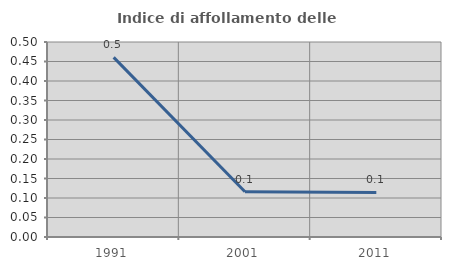
| Category | Indice di affollamento delle abitazioni  |
|---|---|
| 1991.0 | 0.461 |
| 2001.0 | 0.116 |
| 2011.0 | 0.114 |